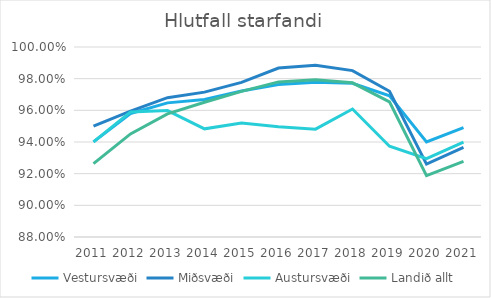
| Category | Vestursvæði | Miðsvæði | Austursvæði | Landið allt |
|---|---|---|---|---|
| 2011.0 | 0.94 | 0.95 | 0.94 | 0.926 |
| 2012.0 | 0.958 | 0.96 | 0.959 | 0.945 |
| 2013.0 | 0.965 | 0.968 | 0.96 | 0.958 |
| 2014.0 | 0.967 | 0.971 | 0.948 | 0.965 |
| 2015.0 | 0.972 | 0.978 | 0.952 | 0.972 |
| 2016.0 | 0.976 | 0.987 | 0.95 | 0.978 |
| 2017.0 | 0.978 | 0.988 | 0.948 | 0.979 |
| 2018.0 | 0.977 | 0.985 | 0.961 | 0.977 |
| 2019.0 | 0.969 | 0.972 | 0.937 | 0.965 |
| 2020.0 | 0.94 | 0.926 | 0.93 | 0.919 |
| 2021.0 | 0.949 | 0.937 | 0.94 | 0.928 |